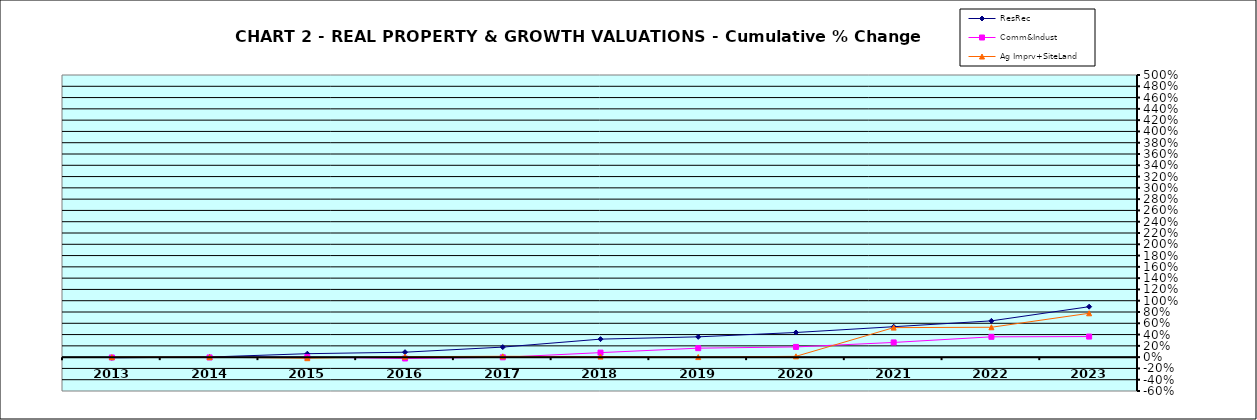
| Category | ResRec | Comm&Indust | Ag Imprv+SiteLand |
|---|---|---|---|
| 2013.0 | -0.012 | -0.006 | 0 |
| 2014.0 | 0.002 | -0.005 | 0 |
| 2015.0 | 0.061 | 0 | -0.019 |
| 2016.0 | 0.088 | -0.024 | 0.009 |
| 2017.0 | 0.178 | -0.003 | 0.015 |
| 2018.0 | 0.319 | 0.08 | 0.01 |
| 2019.0 | 0.36 | 0.159 | 0.001 |
| 2020.0 | 0.437 | 0.181 | 0.014 |
| 2021.0 | 0.539 | 0.26 | 0.523 |
| 2022.0 | 0.643 | 0.36 | 0.53 |
| 2023.0 | 0.894 | 0.365 | 0.777 |